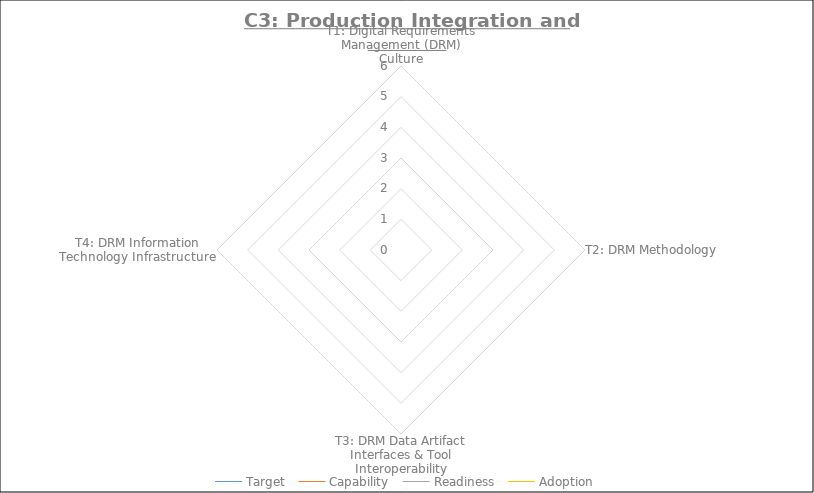
| Category | Target | Capability | Readiness | Adoption |
|---|---|---|---|---|
| T1: Digital Requirements Management (DRM) Culture | 0 | 0 | 0 | 0 |
| T2: DRM Methodology | 0 | 0 | 0 | 0 |
| T3: DRM Data Artifact Interfaces & Tool Interoperability | 0 | 0 | 0 | 0 |
| T4: DRM Information Technology Infrastructure | 0 | 0 | 0 | 0 |